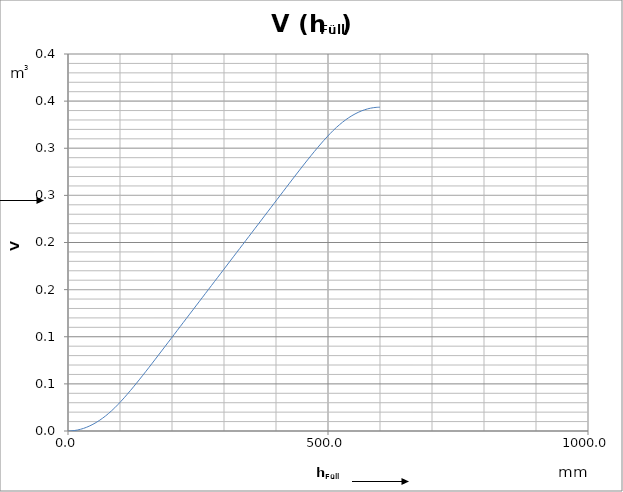
| Category | Series 0 |
|---|---|
| 0.0 | 0 |
| 6.0 | 0 |
| 12.0 | 0 |
| 18.0 | 0.001 |
| 24.0 | 0.002 |
| 30.0 | 0.003 |
| 36.0 | 0.004 |
| 42.0 | 0.005 |
| 48.0 | 0.007 |
| 54.0 | 0.009 |
| 60.0 | 0.011 |
| 66.0 | 0.013 |
| 72.0 | 0.016 |
| 78.0 | 0.019 |
| 84.0 | 0.022 |
| 90.0 | 0.025 |
| 96.0 | 0.028 |
| 102.0 | 0.032 |
| 108.0 | 0.035 |
| 114.0 | 0.039 |
| 120.0 | 0.043 |
| 126.0 | 0.047 |
| 132.0 | 0.051 |
| 138.0 | 0.055 |
| 144.0 | 0.059 |
| 150.0 | 0.063 |
| 156.0 | 0.068 |
| 162.0 | 0.072 |
| 168.0 | 0.076 |
| 174.0 | 0.081 |
| 180.0 | 0.085 |
| 186.0 | 0.089 |
| 192.0 | 0.094 |
| 198.0 | 0.098 |
| 204.0 | 0.102 |
| 210.0 | 0.107 |
| 216.0 | 0.111 |
| 222.0 | 0.115 |
| 228.0 | 0.12 |
| 234.0 | 0.124 |
| 240.0 | 0.128 |
| 246.0 | 0.133 |
| 252.0 | 0.137 |
| 258.0 | 0.141 |
| 264.0 | 0.146 |
| 270.0 | 0.15 |
| 276.0 | 0.154 |
| 282.0 | 0.159 |
| 288.0 | 0.163 |
| 294.0 | 0.167 |
| 300.0 | 0.172 |
| 306.0 | 0.176 |
| 312.0 | 0.18 |
| 318.0 | 0.185 |
| 324.0 | 0.189 |
| 330.0 | 0.193 |
| 336.0 | 0.198 |
| 342.0 | 0.202 |
| 348.0 | 0.207 |
| 354.0 | 0.211 |
| 360.0 | 0.215 |
| 366.0 | 0.22 |
| 372.0 | 0.224 |
| 378.0 | 0.228 |
| 384.0 | 0.233 |
| 390.0 | 0.237 |
| 396.0 | 0.241 |
| 402.0 | 0.246 |
| 408.0 | 0.25 |
| 414.0 | 0.254 |
| 420.0 | 0.259 |
| 426.0 | 0.263 |
| 432.0 | 0.267 |
| 438.0 | 0.272 |
| 444.0 | 0.276 |
| 450.0 | 0.28 |
| 456.0 | 0.284 |
| 462.0 | 0.289 |
| 468.0 | 0.293 |
| 474.0 | 0.297 |
| 480.0 | 0.301 |
| 486.0 | 0.305 |
| 492.0 | 0.308 |
| 498.0 | 0.312 |
| 504.0 | 0.316 |
| 510.0 | 0.319 |
| 516.0 | 0.322 |
| 522.0 | 0.325 |
| 528.0 | 0.328 |
| 534.0 | 0.33 |
| 540.0 | 0.332 |
| 546.0 | 0.335 |
| 552.0 | 0.336 |
| 558.0 | 0.338 |
| 564.0 | 0.34 |
| 570.0 | 0.341 |
| 576.0 | 0.342 |
| 582.0 | 0.343 |
| 588.0 | 0.343 |
| 594.0 | 0.343 |
| 600.0 | 0.344 |